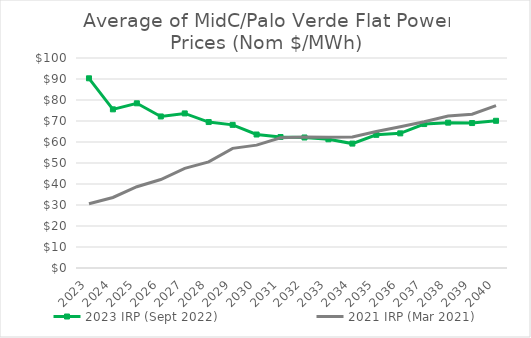
| Category | 2023 IRP (Sept 2022) | 2021 IRP (Mar 2021) |
|---|---|---|
| 2023.0 | 90.331 | 30.589 |
| 2024.0 | 75.557 | 33.584 |
| 2025.0 | 78.425 | 38.715 |
| 2026.0 | 72.158 | 42.143 |
| 2027.0 | 73.613 | 47.472 |
| 2028.0 | 69.495 | 50.511 |
| 2029.0 | 68.167 | 56.963 |
| 2030.0 | 63.565 | 58.505 |
| 2031.0 | 62.375 | 61.997 |
| 2032.0 | 62.144 | 62.408 |
| 2033.0 | 61.287 | 62.299 |
| 2034.0 | 59.245 | 62.384 |
| 2035.0 | 63.408 | 65.008 |
| 2036.0 | 64.116 | 67.272 |
| 2037.0 | 68.546 | 69.669 |
| 2038.0 | 69.218 | 72.371 |
| 2039.0 | 69.023 | 73.204 |
| 2040.0 | 70.103 | 77.326 |